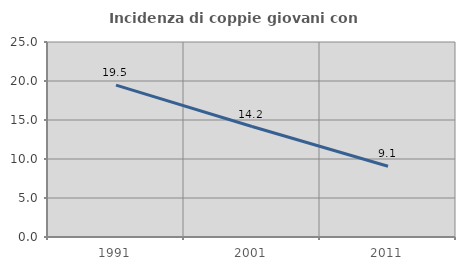
| Category | Incidenza di coppie giovani con figli |
|---|---|
| 1991.0 | 19.469 |
| 2001.0 | 14.161 |
| 2011.0 | 9.071 |